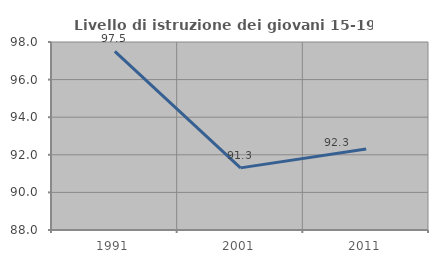
| Category | Livello di istruzione dei giovani 15-19 anni |
|---|---|
| 1991.0 | 97.5 |
| 2001.0 | 91.304 |
| 2011.0 | 92.308 |